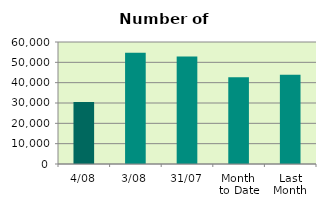
| Category | Series 0 |
|---|---|
| 4/08 | 30546 |
| 3/08 | 54714 |
| 31/07 | 52852 |
| Month 
to Date | 42630 |
| Last
Month | 43867.217 |